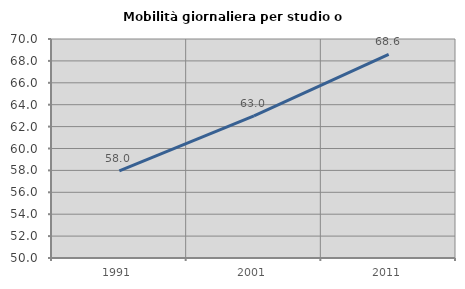
| Category | Mobilità giornaliera per studio o lavoro |
|---|---|
| 1991.0 | 57.953 |
| 2001.0 | 62.978 |
| 2011.0 | 68.599 |